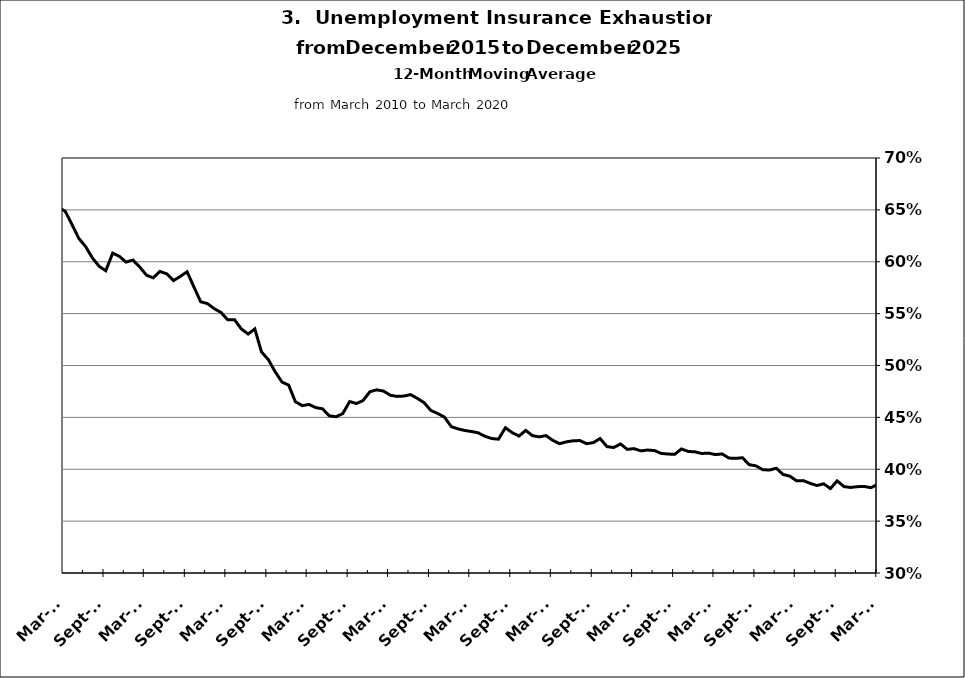
| Category | Series 0 |
|---|---|
| 2002-12-31 | 0.428 |
| 2003-01-31 | 0.432 |
| 2003-02-28 | 0.437 |
| 2003-03-31 | 0.445 |
| 2003-04-30 | 0.455 |
| 2003-05-31 | 0.466 |
| 2003-06-30 | 0.475 |
| 2003-07-31 | 0.485 |
| 2003-08-31 | 0.499 |
| 2003-09-30 | 0.502 |
| 2003-10-31 | 0.5 |
| 2003-11-30 | 0.506 |
| 2003-12-31 | 0.505 |
| 2004-01-31 | 0.505 |
| 2004-02-29 | 0.507 |
| 2004-03-31 | 0.501 |
| 2004-04-30 | 0.491 |
| 2004-05-31 | 0.486 |
| 2004-06-30 | 0.477 |
| 2004-07-31 | 0.466 |
| 2004-08-31 | 0.464 |
| 2004-09-30 | 0.452 |
| 2004-10-31 | 0.448 |
| 2004-11-30 | 0.44 |
| 2004-12-31 | 0.429 |
| 2005-01-31 | 0.429 |
| 2005-02-28 | 0.418 |
| 2005-03-31 | 0.412 |
| 2005-04-30 | 0.409 |
| 2005-05-31 | 0.404 |
| 2005-06-30 | 0.398 |
| 2005-07-31 | 0.4 |
| 2005-08-31 | 0.398 |
| 2005-09-30 | 0.398 |
| 2005-10-31 | 0.398 |
| 2005-11-30 | 0.392 |
| 2005-12-31 | 0.391 |
| 2006-01-31 | 0.388 |
| 2006-02-28 | 0.385 |
| 2006-03-31 | 0.381 |
| 2006-04-30 | 0.383 |
| 2006-05-31 | 0.387 |
| 2006-06-30 | 0.387 |
| 2006-07-31 | 0.393 |
| 2006-08-31 | 0.401 |
| 2006-09-30 | 0.415 |
| 2006-10-31 | 0.422 |
| 2006-11-30 | 0.423 |
| 2006-12-31 | 0.427 |
| 2007-01-31 | 0.425 |
| 2007-02-28 | 0.427 |
| 2007-03-31 | 0.431 |
| 2007-04-30 | 0.437 |
| 2007-05-31 | 0.434 |
| 2007-06-30 | 0.436 |
| 2007-07-30 | 0.443 |
| 2007-08-31 | 0.435 |
| 2007-09-30 | 0.437 |
| 2007-10-31 | 0.433 |
| 2007-11-15 | 0.438 |
| 2007-12-15 09:36:00 | 0.446 |
| 2008-01-14 19:12:00 | 0.447 |
| 2008-02-14 04:48:00 | 0.455 |
| 2008-03-15 14:24:00 | 0.462 |
| 2008-04-15 | 0.462 |
| 2008-05-15 09:36:00 | 0.467 |
| 2008-06-14 19:12:00 | 0.475 |
| 2008-07-15 04:48:00 | 0.47 |
| 2008-08-14 14:24:00 | 0.469 |
| 2008-09-14 | 0.473 |
| 2008-10-14 09:36:00 | 0.478 |
| 2008-11-13 19:12:00 | 0.489 |
| 2008-12-14 04:48:00 | 0.497 |
| 2009-01-13 14:24:00 | 0.51 |
| 2009-02-13 | 0.528 |
| 2009-03-15 09:36:00 | 0.547 |
| 2009-04-14 19:12:00 | 0.565 |
| 2009-05-15 04:48:00 | 0.582 |
| 2009-06-14 14:24:00 | 0.6 |
| 2009-07-15 | 0.611 |
| 2009-08-14 09:36:00 | 0.631 |
| 2009-09-13 19:12:00 | 0.623 |
| 2009-10-14 04:48:00 | 0.631 |
| 2009-11-13 14:24:00 | 0.65 |
| 2009-12-14 | 0.65 |
| 2010-01-13 09:36:00 | 0.657 |
| 2010-02-12 19:12:00 | 0.652 |
| 2010-03-15 04:48:00 | 0.649 |
| 2010-04-14 14:24:00 | 0.636 |
| 2010-05-15 | 0.623 |
| 2010-06-14 09:36:00 | 0.615 |
| 2010-07-14 19:12:00 | 0.604 |
| 2010-08-14 04:48:00 | 0.596 |
| 2010-09-13 14:24:00 | 0.591 |
| 2010-10-14 | 0.608 |
| 2010-11-13 09:36:00 | 0.605 |
| 2010-12-13 19:12:00 | 0.6 |
| 2011-01-13 04:48:00 | 0.602 |
| 2011-02-12 14:24:00 | 0.595 |
| 2011-03-15 | 0.587 |
| 2011-04-14 09:36:00 | 0.584 |
| 2011-05-14 19:12:00 | 0.591 |
| 2011-06-14 04:48:00 | 0.588 |
| 2011-07-14 14:24:00 | 0.582 |
| 2011-08-14 | 0.586 |
| 2011-09-13 09:36:00 | 0.59 |
| 2011-10-13 19:12:00 | 0.576 |
| 2011-11-13 04:48:00 | 0.561 |
| 2011-12-13 14:24:00 | 0.56 |
| 2012-01-13 | 0.555 |
| 2012-02-12 09:36:00 | 0.551 |
| 2012-03-13 19:12:00 | 0.544 |
| 2012-04-13 04:48:00 | 0.544 |
| 2012-05-13 14:24:00 | 0.535 |
| 2012-06-13 | 0.53 |
| 2012-07-13 09:36:00 | 0.535 |
| 2012-08-12 19:12:00 | 0.513 |
| 2012-09-12 04:48:00 | 0.506 |
| 2012-10-12 14:24:00 | 0.494 |
| 2012-11-12 | 0.484 |
| 2012-12-12 09:36:00 | 0.481 |
| 2013-01-11 19:12:00 | 0.465 |
| 2013-02-11 04:48:00 | 0.461 |
| 2013-03-13 14:24:00 | 0.462 |
| 2013-04-13 | 0.459 |
| 2013-05-13 09:36:00 | 0.458 |
| 2013-06-12 19:12:00 | 0.452 |
| 2013-07-13 04:48:00 | 0.451 |
| 2013-08-12 14:24:00 | 0.454 |
| 2013-09-12 | 0.465 |
| 2013-10-12 09:36:00 | 0.463 |
| 2013-11-11 19:12:00 | 0.466 |
| 2013-12-12 04:48:00 | 0.475 |
| 2014-01-11 14:24:00 | 0.477 |
| 2014-02-11 | 0.475 |
| 2014-03-13 09:36:00 | 0.471 |
| 2014-04-12 19:12:00 | 0.47 |
| 2014-05-13 04:48:00 | 0.471 |
| 2014-06-12 14:24:00 | 0.472 |
| 2014-07-13 | 0.468 |
| 2014-08-12 09:36:00 | 0.464 |
| 2014-09-11 19:12:00 | 0.457 |
| 2014-10-12 04:48:00 | 0.454 |
| 2014-11-11 14:24:00 | 0.45 |
| 2014-12-12 | 0.441 |
| 2015-01-11 09:36:00 | 0.439 |
| 2015-02-10 19:12:00 | 0.437 |
| 2015-03-13 04:48:00 | 0.436 |
| 2015-04-12 14:24:00 | 0.435 |
| 2015-05-13 | 0.432 |
| 2015-06-12 09:36:00 | 0.43 |
| 2015-07-12 19:12:00 | 0.429 |
| 2015-08-12 04:48:00 | 0.44 |
| 2015-09-11 14:24:00 | 0.435 |
| 2015-10-12 | 0.432 |
| 2015-11-11 09:36:00 | 0.437 |
| 2015-12-11 19:12:00 | 0.432 |
| 2016-01-11 04:48:00 | 0.431 |
| 2016-02-10 14:24:00 | 0.432 |
| 2016-03-12 | 0.428 |
| 2016-04-11 09:36:00 | 0.425 |
| 2016-05-11 19:12:00 | 0.426 |
| 2016-06-11 04:48:00 | 0.427 |
| 2016-07-11 14:24:00 | 0.428 |
| 2016-08-11 | 0.425 |
| 2016-09-10 09:36:00 | 0.426 |
| 2016-10-10 19:12:00 | 0.43 |
| 2016-11-10 04:48:00 | 0.422 |
| 2016-12-10 14:24:00 | 0.421 |
| 2017-01-10 | 0.424 |
| 2017-02-09 09:36:00 | 0.419 |
| 2017-03-11 19:12:00 | 0.42 |
| 2017-04-11 04:48:00 | 0.418 |
| 2017-05-11 14:24:00 | 0.418 |
| 2017-06-11 | 0.418 |
| 2017-07-11 09:36:00 | 0.415 |
| 2017-08-10 19:12:00 | 0.415 |
| 2017-09-10 04:48:00 | 0.414 |
| 2017-10-10 14:24:00 | 0.42 |
| 2017-11-10 | 0.417 |
| 2017-12-10 09:36:00 | 0.417 |
| 2018-01-09 19:12:00 | 0.415 |
| 2018-02-09 04:48:00 | 0.416 |
| 2018-03-11 14:24:00 | 0.414 |
| 2018-04-11 | 0.415 |
| 2018-05-11 09:36:00 | 0.411 |
| 2018-06-10 19:12:00 | 0.41 |
| 2018-07-11 04:48:00 | 0.411 |
| 2018-08-10 14:24:00 | 0.404 |
| 2018-09-10 | 0.403 |
| 2018-10-10 09:36:00 | 0.4 |
| 2018-11-09 19:12:00 | 0.399 |
| 2018-12-10 04:48:00 | 0.401 |
| 2019-01-09 14:24:00 | 0.395 |
| 2019-02-09 | 0.393 |
| 2019-03-11 09:36:00 | 0.389 |
| 2019-04-10 19:12:00 | 0.389 |
| 2019-05-11 04:48:00 | 0.386 |
| 2019-06-10 14:24:00 | 0.384 |
| 2019-07-11 | 0.386 |
| 2019-08-10 09:36:00 | 0.381 |
| 2019-09-09 19:12:00 | 0.389 |
| 2019-10-10 04:48:00 | 0.383 |
| 2019-11-09 14:24:00 | 0.382 |
| 2019-12-10 | 0.383 |
| 2020-01-09 09:36:00 | 0.383 |
| 2020-02-08 19:12:00 | 0.382 |
| 2020-03-10 04:48:00 | 0.386 |